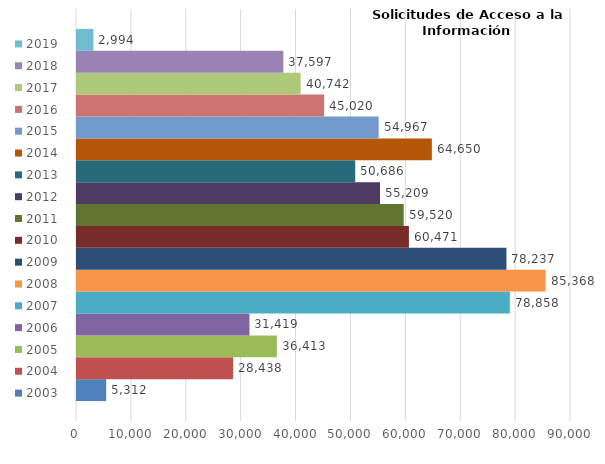
| Category | 2003 | 2004 | 2005 | 2006 | 2007 | 2008 | 2009 | 2010 | 2011 | 2012 | 2013 | 2014 | 2015 | 2016 | 2017 | 2018 | 2019 |
|---|---|---|---|---|---|---|---|---|---|---|---|---|---|---|---|---|---|
| 0 | 5312 | 28438 | 36413 | 31419 | 78858 | 85368 | 78237 | 60471 | 59520 | 55209 | 50686 | 64650 | 54967 | 45020 | 40742 | 37597 | 2994 |